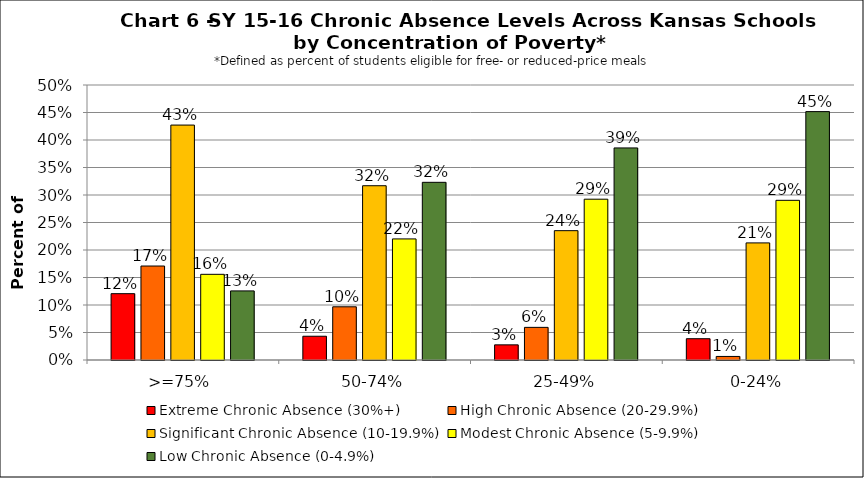
| Category | Extreme Chronic Absence (30%+) | High Chronic Absence (20-29.9%) | Significant Chronic Absence (10-19.9%) | Modest Chronic Absence (5-9.9%) | Low Chronic Absence (0-4.9%) |
|---|---|---|---|---|---|
| 0 | 0.121 | 0.171 | 0.427 | 0.156 | 0.126 |
| 1 | 0.043 | 0.097 | 0.317 | 0.22 | 0.323 |
| 2 | 0.028 | 0.059 | 0.235 | 0.292 | 0.386 |
| 3 | 0.039 | 0.006 | 0.213 | 0.29 | 0.452 |